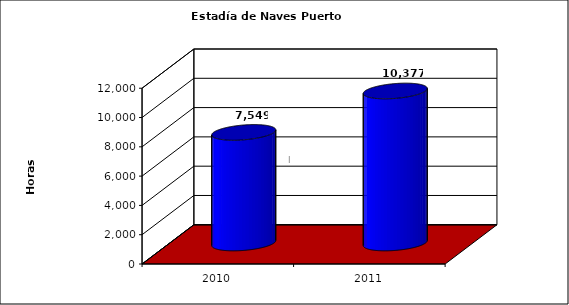
| Category | Series 0 |
|---|---|
| 2010.0 | 7549 |
| 2011.0 | 10377 |